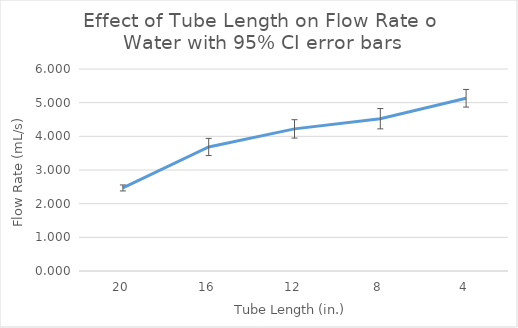
| Category | Times (seconds) |
|---|---|
| 20.0 | 2.467 |
| 16.0 | 3.683 |
| 12.0 | 4.221 |
| 8.0 | 4.523 |
| 4.0 | 5.131 |